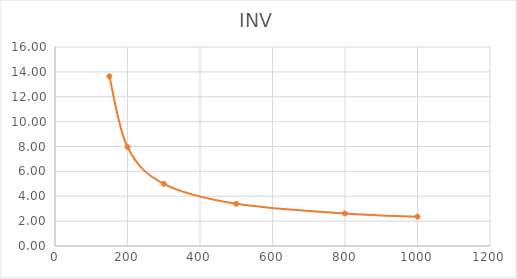
| Category | INV |
|---|---|
| 150.0 | 13.642 |
| 200.0 | 7.957 |
| 300.0 | 5 |
| 500.0 | 3.396 |
| 800.0 | 2.616 |
| 1000.0 | 2.357 |